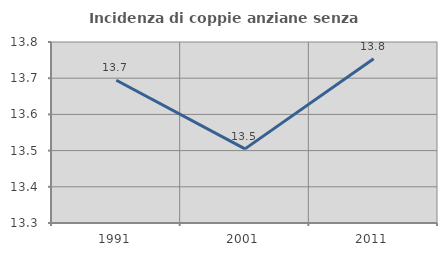
| Category | Incidenza di coppie anziane senza figli  |
|---|---|
| 1991.0 | 13.694 |
| 2001.0 | 13.505 |
| 2011.0 | 13.754 |